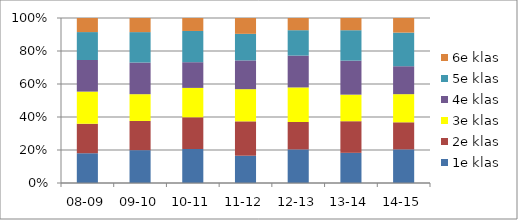
| Category | 1e klas | 2e klas | 3e klas | 4e klas | 5e klas | 6e klas |
|---|---|---|---|---|---|---|
| 08-09 | 112 | 111 | 121 | 119 | 105 | 53 |
| 09-10 | 135 | 120 | 110 | 130 | 125 | 58 |
| 10-11 | 147 | 137 | 127 | 111 | 135 | 56 |
| 11-12 | 112 | 141 | 132 | 118 | 109 | 65 |
| 12-13 | 135 | 110 | 139 | 128 | 102 | 49 |
| 13-14 | 126 | 132 | 111 | 142 | 127 | 51 |
| 14-15 | 159 | 128 | 133 | 132 | 159 | 69 |